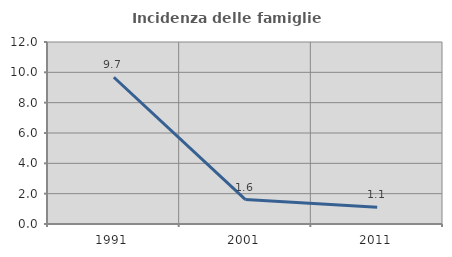
| Category | Incidenza delle famiglie numerose |
|---|---|
| 1991.0 | 9.677 |
| 2001.0 | 1.613 |
| 2011.0 | 1.11 |